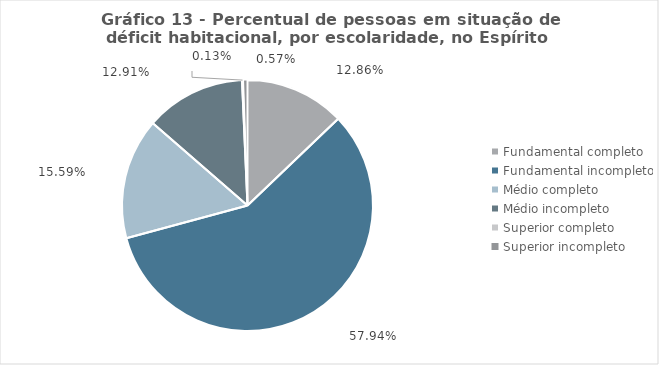
| Category | Series 0 | Improvisado - % | Rustico - Nº | Rustico - % | Coabitação Familiar - Nº | Coabitação Familiar - % | Ônus excessivo com Aluguel - Nº | Ônus excessivo com Aluguel - % | Adensamento Excessivo - Nº | Adensamento Excessivo - % |
|---|---|---|---|---|---|---|---|---|---|---|
| Fundamental completo | 0.129 |  |  |  |  |  |  |  |  |  |
| Fundamental incompleto | 0.579 |  |  |  |  |  |  |  |  |  |
| Médio completo | 0.156 |  |  |  |  |  |  |  |  |  |
| Médio incompleto | 0.129 |  |  |  |  |  |  |  |  |  |
| Superior completo | 0.001 |  |  |  |  |  |  |  |  |  |
| Superior incompleto | 0.006 |  |  |  |  |  |  |  |  |  |